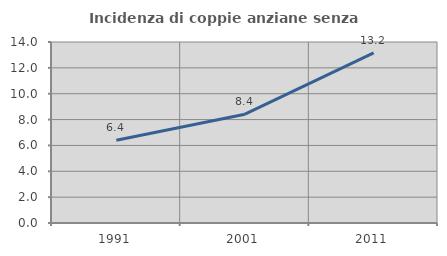
| Category | Incidenza di coppie anziane senza figli  |
|---|---|
| 1991.0 | 6.404 |
| 2001.0 | 8.419 |
| 2011.0 | 13.158 |